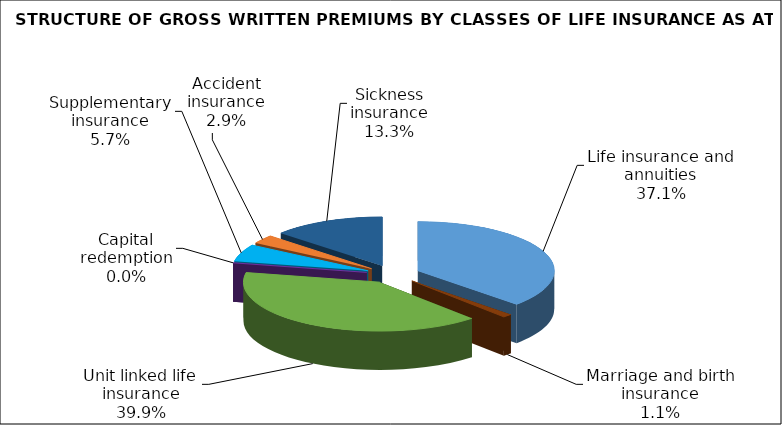
| Category | Series 0 |
|---|---|
| Life insurance and annuities | 179116642.811 |
| Marriage and birth insurance | 5522917.055 |
| Unit linked life insurance | 192807043.412 |
| Capital redemption | 0 |
| Supplementary insurance | 27360959.755 |
| Accident insurance | 13791227.76 |
| Sickness insurance | 64357745.83 |